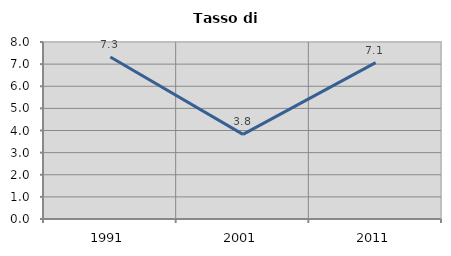
| Category | Tasso di disoccupazione   |
|---|---|
| 1991.0 | 7.324 |
| 2001.0 | 3.826 |
| 2011.0 | 7.065 |